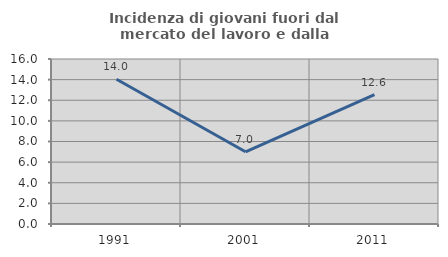
| Category | Incidenza di giovani fuori dal mercato del lavoro e dalla formazione  |
|---|---|
| 1991.0 | 14.035 |
| 2001.0 | 7 |
| 2011.0 | 12.551 |